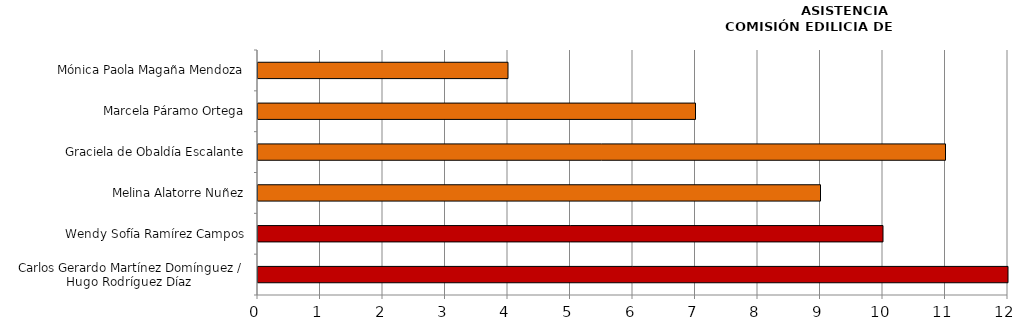
| Category | Series 0 |
|---|---|
| Carlos Gerardo Martínez Domínguez /
Hugo Rodríguez Díaz  | 12 |
| Wendy Sofía Ramírez Campos | 10 |
| Melina Alatorre Nuñez | 9 |
| Graciela de Obaldía Escalante | 11 |
| Marcela Páramo Ortega | 7 |
| Mónica Paola Magaña Mendoza | 4 |